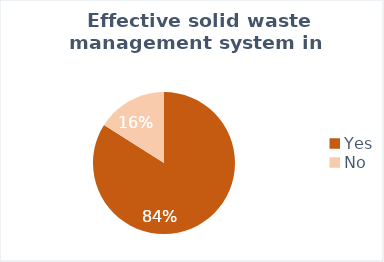
| Category | Rakhine |
|---|---|
| Yes | 21 |
| No | 4 |